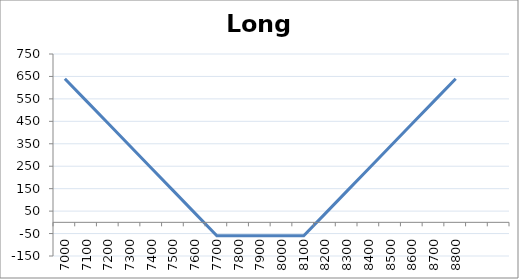
| Category | Series 0 |
|---|---|
| 7000.0 | 640 |
| 7100.0 | 540 |
| 7200.0 | 440 |
| 7300.0 | 340 |
| 7400.0 | 240 |
| 7500.0 | 140 |
| 7600.0 | 40 |
| 7700.0 | -60 |
| 7800.0 | -60 |
| 7900.0 | -60 |
| 8000.0 | -60 |
| 8100.0 | -60 |
| 8200.0 | 40 |
| 8300.0 | 140 |
| 8400.0 | 240 |
| 8500.0 | 340 |
| 8600.0 | 440 |
| 8700.0 | 540 |
| 8800.0 | 640 |